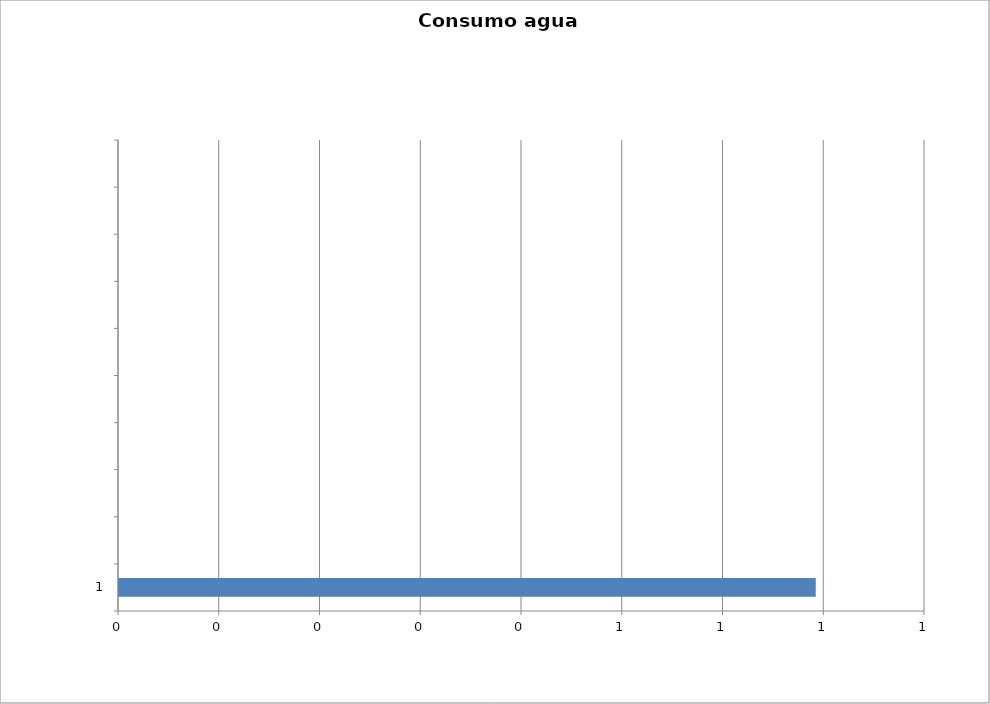
| Category | Series 0 |
|---|---|
| 1 | 0.692 |